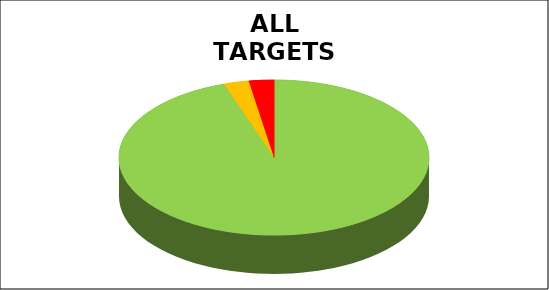
| Category | Series 0 |
|---|---|
| Green | 0.948 |
| Amber | 0.026 |
| Red | 0.026 |